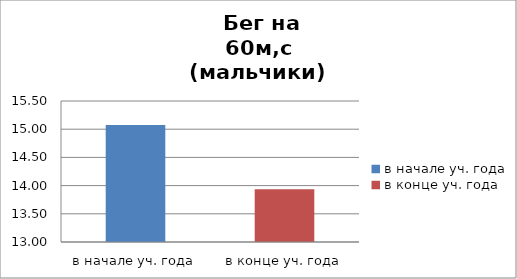
| Category | Series 0 |
|---|---|
| в начале уч. года | 15.075 |
| в конце уч. года | 13.938 |